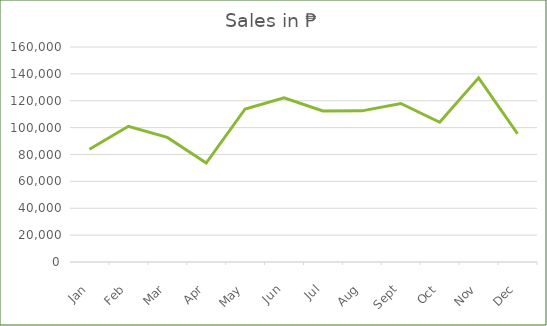
| Category | Sales Converted to Currency |
|---|---|
| 2017-01-01 | 83932.74 |
| 2017-02-01 | 100995.3 |
| 2017-03-01 | 92742.82 |
| 2017-04-01 | 73631.08 |
| 2017-05-01 | 113861.92 |
| 2017-06-01 | 122100.46 |
| 2017-07-01 | 112342.46 |
| 2017-08-01 | 112467.92 |
| 2017-09-01 | 117946.34 |
| 2017-10-01 | 103992.4 |
| 2017-11-01 | 137058.08 |
| 2017-12-01 | 95433.24 |